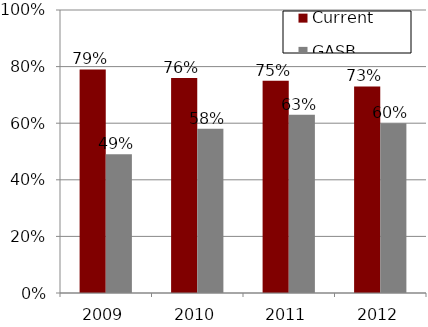
| Category | Current | GASB proposals |
|---|---|---|
| 2009.0 | 0.79 | 0.49 |
| 2010.0 | 0.76 | 0.58 |
| 2011.0 | 0.75 | 0.63 |
| 2012.0 | 0.73 | 0.6 |